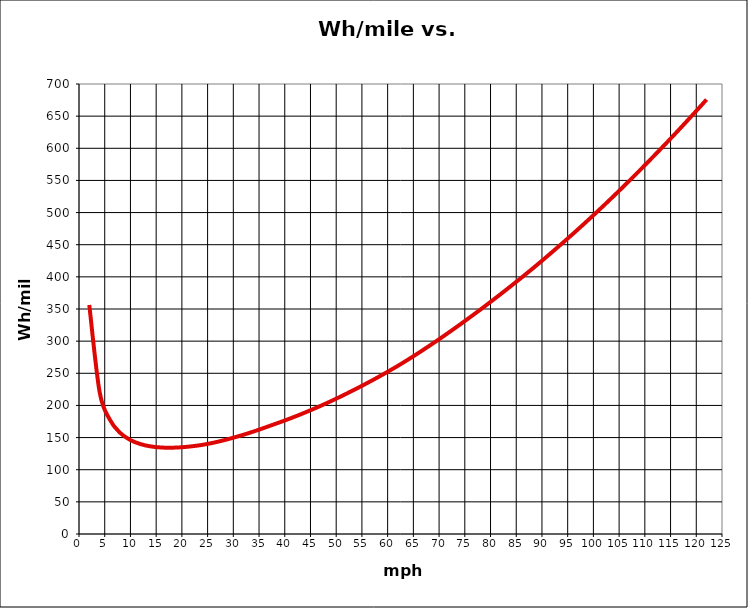
| Category | Wh/mi |
|---|---|
| 2.0 | 356.27 |
| 4.0 | 221.21 |
| 6.0 | 177.81 |
| 8.0 | 157.29 |
| 10.0 | 146.11 |
| 12.0 | 139.72 |
| 14.0 | 136.17 |
| 16.0 | 134.53 |
| 18.0 | 134.21 |
| 20.0 | 134.95 |
| 22.0 | 136.48 |
| 24.0 | 138.68 |
| 26.0 | 141.73 |
| 28.0 | 145.52 |
| 30.0 | 149.79 |
| 32.0 | 154.46 |
| 34.0 | 159.58 |
| 36.0 | 165.11 |
| 38.0 | 170.82 |
| 40.0 | 176.56 |
| 42.0 | 182.68 |
| 44.0 | 189.14 |
| 46.0 | 195.93 |
| 48.0 | 203.03 |
| 50.0 | 210.48 |
| 52.0 | 218.26 |
| 54.0 | 226.34 |
| 56.0 | 234.7 |
| 58.0 | 243.34 |
| 60.0 | 252.33 |
| 62.0 | 261.63 |
| 64.0 | 271.44 |
| 66.0 | 281.63 |
| 68.0 | 292.13 |
| 70.0 | 302.95 |
| 72.0 | 314.07 |
| 74.0 | 325.45 |
| 76.0 | 337.11 |
| 78.0 | 348.88 |
| 80.0 | 361.01 |
| 82.0 | 373.33 |
| 84.0 | 385.89 |
| 86.0 | 398.66 |
| 88.0 | 411.68 |
| 90.0 | 425.03 |
| 92.0 | 438.72 |
| 94.0 | 452.61 |
| 96.0 | 466.71 |
| 98.0 | 481.16 |
| 100.0 | 495.83 |
| 102.0 | 510.83 |
| 104.0 | 526.11 |
| 106.0 | 541.68 |
| 108.0 | 557.52 |
| 110.0 | 573.64 |
| 112.0 | 590.03 |
| 114.0 | 606.57 |
| 116.0 | 623.48 |
| 118.0 | 640.67 |
| 120.0 | 658.11 |
| 122.0 | 675.77 |